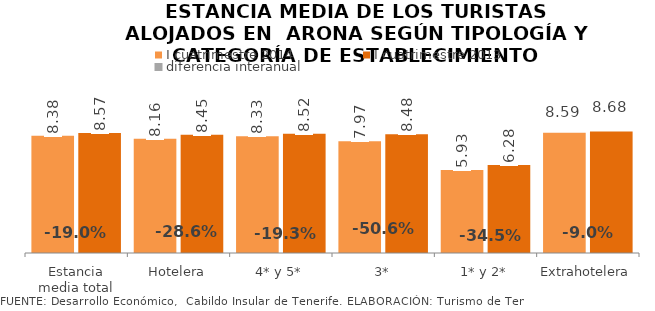
| Category | I cuatrimestre 2014 | I cuatrimestre 2013 |
|---|---|---|
| Estancia media total | 8.377 | 8.566 |
| Hotelera | 8.164 | 8.451 |
| 4* y 5* | 8.33 | 8.524 |
| 3* | 7.975 | 8.48 |
| 1* y 2* | 5.932 | 6.277 |
| Extrahotelera | 8.587 | 8.677 |